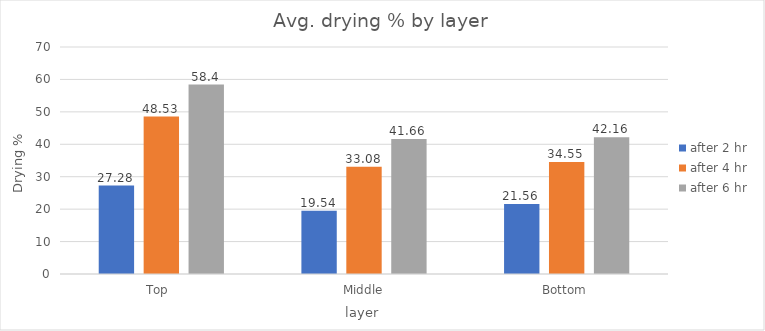
| Category | after 2 hr | after 4 hr | after 6 hr |
|---|---|---|---|
| Top  | 27.28 | 48.53 | 58.4 |
| Middle | 19.54 | 33.08 | 41.66 |
| Bottom | 21.56 | 34.55 | 42.16 |